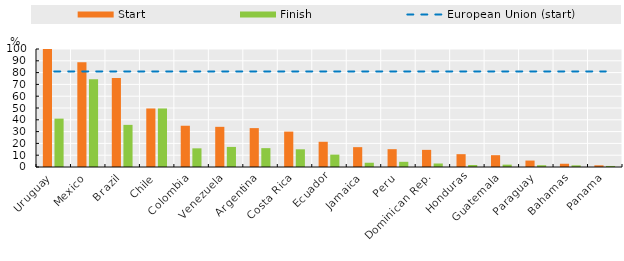
| Category | Start | Finish |
|---|---|---|
| Uruguay | 100 | 41 |
| Mexico | 88.774 | 74.33 |
| Brazil | 75.4 | 35.7 |
| Chile | 49.6 | 49.6 |
| Colombia | 34.963 | 15.811 |
| Venezuela | 34.043 | 17.021 |
| Argentina | 32.958 | 15.981 |
| Costa Rica | 30 | 15 |
| Ecuador | 21.372 | 10.5 |
| Jamaica | 16.823 | 3.61 |
| Peru | 15.1 | 4.4 |
| Dominican Rep. | 14.524 | 2.96 |
| Honduras | 10.88 | 1.679 |
| Guatemala | 10 | 2 |
| Paraguay | 5.446 | 1.485 |
| Bahamas | 2.75 | 1.4 |
| Panama | 1.418 | 0.876 |